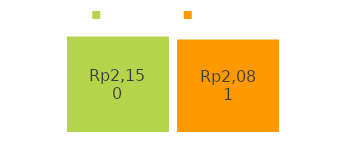
| Category | masuk | keluar |
|---|---|---|
| uang masuk: | 2150 | 2081 |